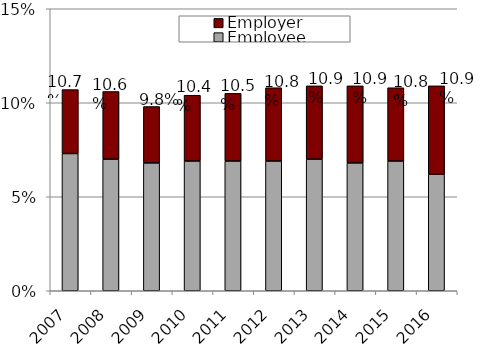
| Category | Employee | Employer  |
|---|---|---|
| 2007.0 | 0.073 | 0.034 |
| 2008.0 | 0.07 | 0.036 |
| 2009.0 | 0.068 | 0.03 |
| 2010.0 | 0.069 | 0.035 |
| 2011.0 | 0.069 | 0.036 |
| 2012.0 | 0.069 | 0.039 |
| 2013.0 | 0.07 | 0.039 |
| 2014.0 | 0.068 | 0.041 |
| 2015.0 | 0.069 | 0.039 |
| 2016.0 | 0.062 | 0.047 |